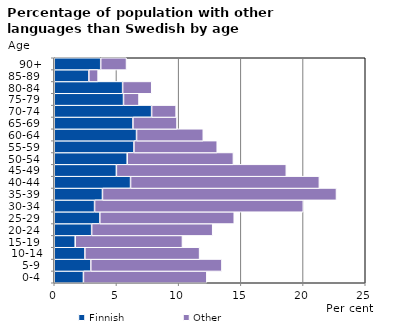
| Category | Finnish | Other |
|---|---|---|
|   0-4  | 2.346 | 9.92 |
|   5-9  | 2.938 | 10.541 |
| 10-14 | 2.463 | 9.221 |
| 15-19  | 1.685 | 8.62 |
| 20-24  | 3.006 | 9.731 |
| 25-29  | 3.663 | 10.806 |
| 30-34  | 3.241 | 16.78 |
| 35-39  | 3.876 | 18.811 |
| 40-44  | 6.134 | 15.177 |
| 45-49  | 4.995 | 13.66 |
| 50-54  | 5.866 | 8.536 |
| 55-59  | 6.405 | 6.696 |
| 60-64  | 6.615 | 5.365 |
| 65-69  | 6.326 | 3.543 |
| 70-74  | 7.827 | 1.97 |
| 75-79  | 5.568 | 1.245 |
| 80-84  | 5.497 | 2.339 |
| 85-89  | 2.783 | 0.742 |
| 90+ | 3.734 | 2.075 |